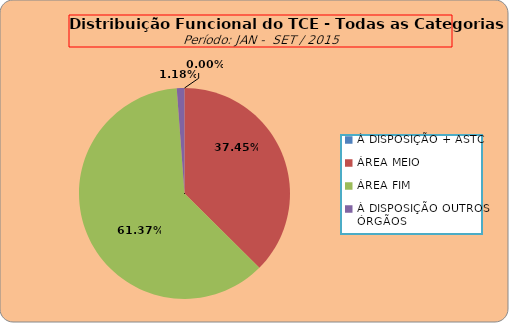
| Category | Series 0 |
|---|---|
| À DISPOSIÇÃO + ASTC | 0 |
| ÁREA MEIO | 191 |
| ÁREA FIM | 313 |
| À DISPOSIÇÃO OUTROS ÓRGÃOS | 6 |